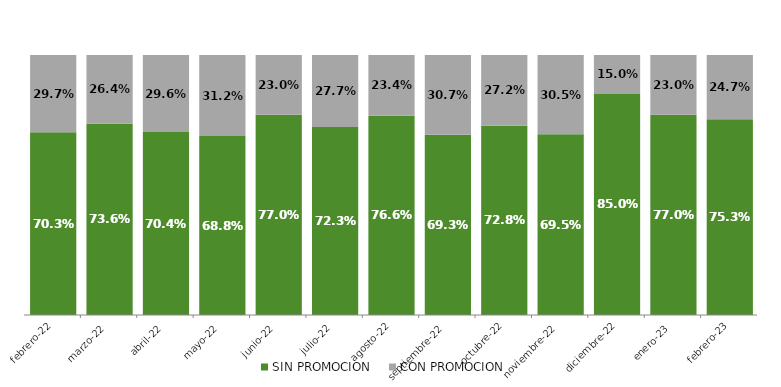
| Category | SIN PROMOCION   | CON PROMOCION   |
|---|---|---|
| 2022-02-01 | 0.703 | 0.297 |
| 2022-03-01 | 0.736 | 0.264 |
| 2022-04-01 | 0.704 | 0.296 |
| 2022-05-01 | 0.688 | 0.312 |
| 2022-06-01 | 0.77 | 0.23 |
| 2022-07-01 | 0.723 | 0.277 |
| 2022-08-01 | 0.766 | 0.234 |
| 2022-09-01 | 0.693 | 0.307 |
| 2022-10-01 | 0.728 | 0.272 |
| 2022-11-01 | 0.695 | 0.305 |
| 2022-12-01 | 0.85 | 0.15 |
| 2023-01-01 | 0.77 | 0.23 |
| 2023-02-01 | 0.753 | 0.247 |